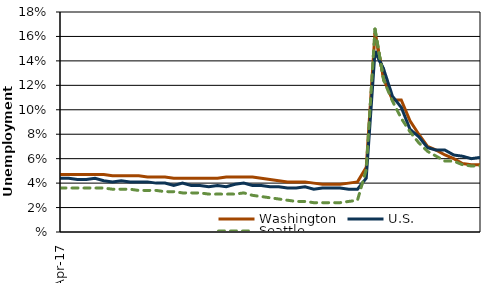
| Category | Washington | U.S. | Seattle |
|---|---|---|---|
| 2017-04-01 | 4.7 | 4.4 | 3.6 |
| 2017-05-01 | 4.7 | 4.4 | 3.6 |
| 2017-06-01 | 4.7 | 4.3 | 3.6 |
| 2017-07-01 | 4.7 | 4.3 | 3.6 |
| 2017-08-01 | 4.7 | 4.4 | 3.6 |
| 2017-09-01 | 4.7 | 4.2 | 3.6 |
| 2017-10-01 | 4.6 | 4.1 | 3.5 |
| 2017-11-01 | 4.6 | 4.2 | 3.5 |
| 2017-12-01 | 4.6 | 4.1 | 3.5 |
| 2018-01-01 | 4.6 | 4.1 | 3.4 |
| 2018-02-01 | 4.5 | 4.1 | 3.4 |
| 2018-03-01 | 4.5 | 4 | 3.4 |
| 2018-04-01 | 4.5 | 4 | 3.3 |
| 2018-05-01 | 4.4 | 3.8 | 3.3 |
| 2018-06-01 | 4.4 | 4 | 3.2 |
| 2018-07-01 | 4.4 | 3.8 | 3.2 |
| 2018-08-01 | 4.4 | 3.8 | 3.2 |
| 2018-09-01 | 4.4 | 3.7 | 3.1 |
| 2018-10-01 | 4.4 | 3.8 | 3.1 |
| 2018-11-01 | 4.5 | 3.7 | 3.1 |
| 2018-12-01 | 4.5 | 3.9 | 3.1 |
| 2019-01-01 | 4.5 | 4 | 3.2 |
| 2019-02-01 | 4.5 | 3.8 | 3 |
| 2019-03-01 | 4.4 | 3.8 | 2.9 |
| 2019-04-01 | 4.3 | 3.7 | 2.8 |
| 2019-05-01 | 4.2 | 3.7 | 2.7 |
| 2019-06-01 | 4.1 | 3.6 | 2.6 |
| 2019-07-01 | 4.1 | 3.6 | 2.5 |
| 2019-08-01 | 4.1 | 3.7 | 2.5 |
| 2019-09-01 | 4 | 3.5 | 2.4 |
| 2019-10-01 | 3.9 | 3.6 | 2.4 |
| 2019-11-01 | 3.9 | 3.6 | 2.4 |
| 2019-12-01 | 3.9 | 3.6 | 2.4 |
| 2020-01-01 | 4 | 3.5 | 2.5 |
| 2020-02-01 | 4.1 | 3.5 | 2.6 |
| 2020-03-01 | 5.3 | 4.4 | 5.1 |
| 2020-04-01 | 16.3 | 14.8 | 16.6 |
| 2020-05-01 | 12.5 | 13.3 | 12.4 |
| 2020-06-01 | 10.8 | 11.1 | 10.7 |
| 2020-07-01 | 10.8 | 10.2 | 9.3 |
| 2020-08-01 | 9.1 | 8.4 | 8.2 |
| 2020-09-01 | 8 | 7.8 | 7.3 |
| 2020-10-01 | 7 | 6.9 | 6.6 |
| 2020-11-01 | 6.7 | 6.7 | 6.2 |
| 2020-12-01 | 6.3 | 6.7 | 5.8 |
| 2021-01-01 | 6 | 6.3 | 5.8 |
| 2021-02-01 | 5.6 | 6.2 | 5.5 |
| 2021-03-01 | 5.5 | 6 | 5.4 |
| 2021-04-01 | 5.5 | 6.1 | 5.4 |